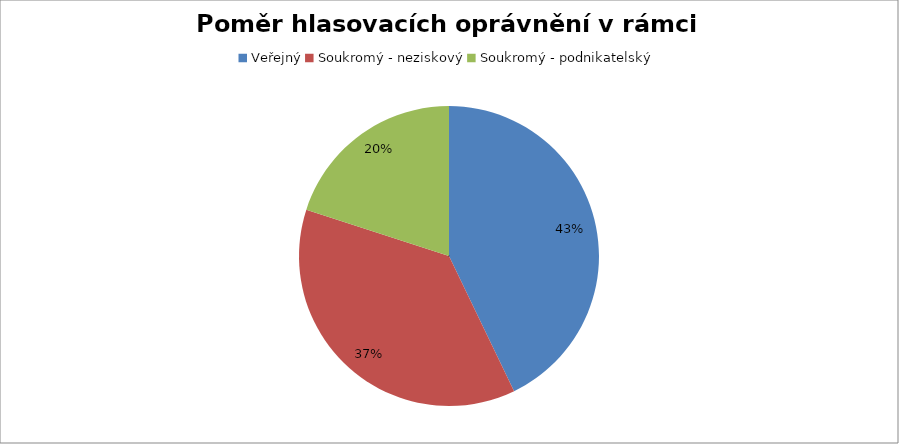
| Category | Series 0 |
|---|---|
| Veřejný | 0.429 |
| Soukromý - neziskový | 0.371 |
| Soukromý - podnikatelský | 0.2 |